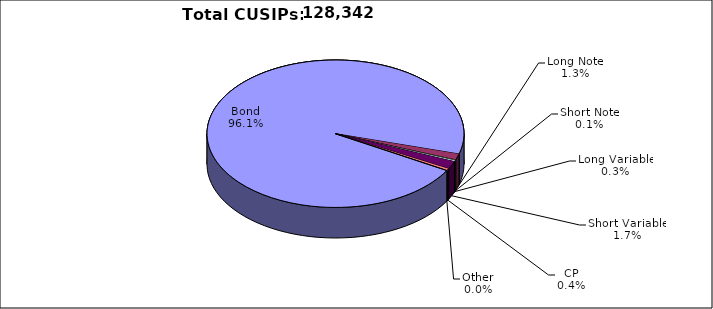
| Category | CUSIPs |
|---|---|
| Bond | 123344 |
| Long Note | 1711 |
| Short Note | 163 |
| Long Variable | 351 |
| Short Variable | 2174 |
| CP | 545 |
| Other | 54 |